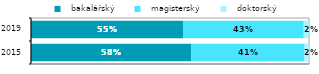
| Category |   bakalářský |   magisterský |   doktorský |
|---|---|---|---|
| 2015.0 | 0.576 | 0.408 | 0.016 |
| 2019.0 | 0.547 | 0.434 | 0.019 |